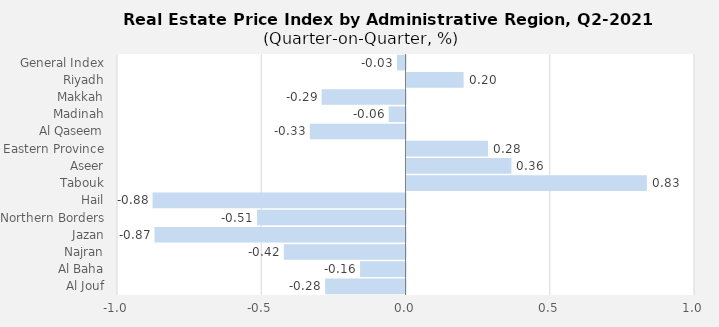
| Category | 2021 |
|---|---|
| General Index | -0.03 |
| Riyadh | 0.198 |
| Makkah | -0.291 |
| Madinah | -0.058 |
| Al Qaseem | -0.332 |
| Eastern Province | 0.282 |
| Aseer | 0.364 |
| Tabouk | 0.833 |
| Hail | -0.877 |
| Northern Borders | -0.514 |
| Jazan | -0.87 |
| Najran | -0.422 |
| Al Baha | -0.158 |
| Al Jouf | -0.278 |